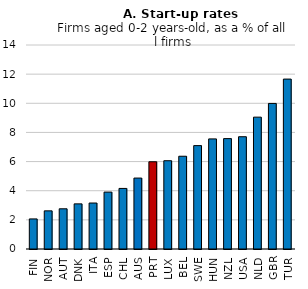
| Category | Average |
|---|---|
| FIN | 2.064 |
| NOR | 2.618 |
| AUT | 2.759 |
| DNK | 3.097 |
| ITA | 3.156 |
| ESP | 3.905 |
| CHL | 4.157 |
| AUS | 4.867 |
| PRT | 5.987 |
| LUX | 6.058 |
| BEL | 6.366 |
| SWE | 7.094 |
| HUN | 7.556 |
| NZL | 7.575 |
| USA | 7.706 |
| NLD | 9.049 |
| GBR | 9.991 |
| TUR | 11.661 |